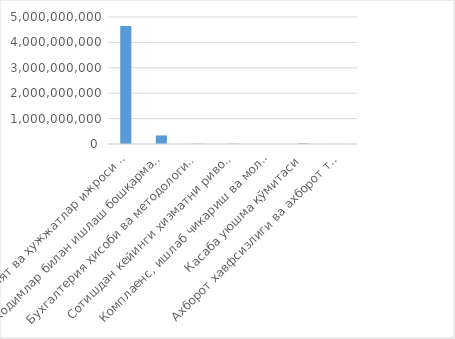
| Category | Товар / хизматнинг
жами суммаси
(cумда) 
(ҚҚС билан) |
|---|---|
| Маъмурият ва ҳужжатлар ижроси назорати бошқармаси | 4645688580 |
| Ходимлар билан ишлаш бошқармаси | 336732000 |
| Бухгалтерия ҳисоби ва методология бошқармаси | 10000000 |
| Сотишдан кейинги хизматни ривожлантириш бошқармаси | 9740000 |
| Комплаенс, ишлаб чикариш ва молиявий хавфларни мониторинг қилиш департаменти | 791000 |
| Касаба уюшма қўмитаси | 22600000 |
| Ахборот хавфсизлиги ва ахборот технологияларини ривожлантириш бошқармаси | 2400000 |